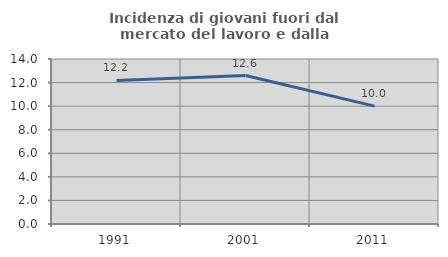
| Category | Incidenza di giovani fuori dal mercato del lavoro e dalla formazione  |
|---|---|
| 1991.0 | 12.18 |
| 2001.0 | 12.596 |
| 2011.0 | 10 |